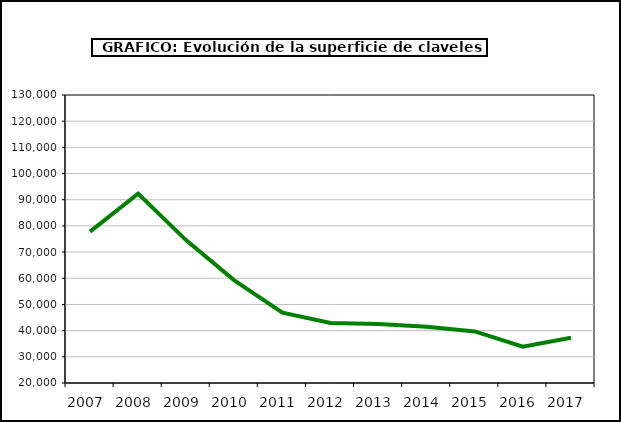
| Category | superficie |
|---|---|
| 2007.0 | 77836 |
| 2008.0 | 92310 |
| 2009.0 | 74481 |
| 2010.0 | 59199 |
| 2011.0 | 46860 |
| 2012.0 | 42920 |
| 2013.0 | 42572 |
| 2014.0 | 41501 |
| 2015.0 | 39713 |
| 2016.0 | 33880 |
| 2017.0 | 37286 |